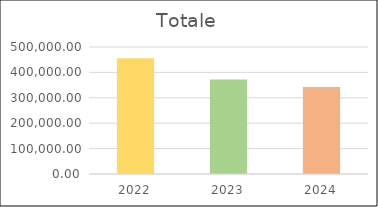
| Category | Series 0 |
|---|---|
| 2022.0 | 456050 |
| 2023.0 | 372250 |
| 2024.0 | 342250 |